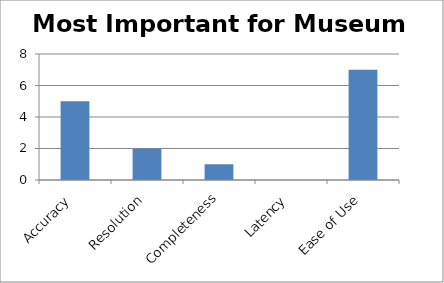
| Category | Most Important for Museum Curator |
|---|---|
| Accuracy | 5 |
| Resolution | 2 |
| Completeness | 1 |
| Latency | 0 |
| Ease of Use | 7 |